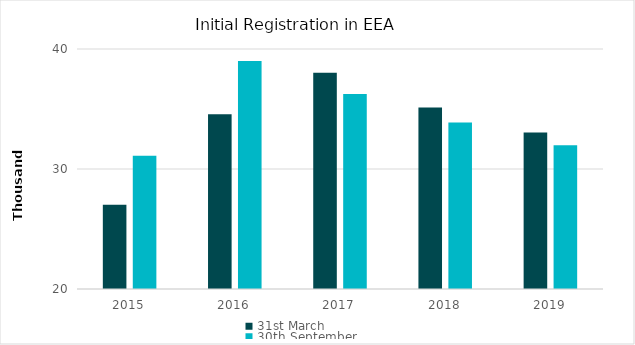
| Category | 31st March | 30th September |
|---|---|---|
| 2015.0 | 27012 | 31099 |
| 2016.0 | 34572 | 38992 |
| 2017.0 | 38024 | 36259 |
| 2018.0 | 35115 | 33874 |
| 2019.0 | 33035 | 31973 |